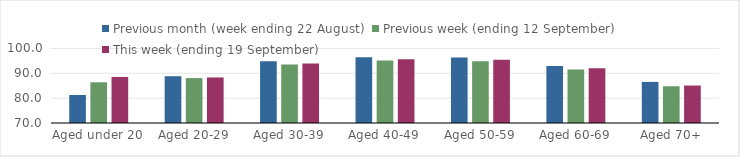
| Category | Previous month (week ending 22 August) | Previous week (ending 12 September) | This week (ending 19 September) |
|---|---|---|---|
| Aged under 20 | 81.27 | 86.38 | 88.52 |
| Aged 20-29 | 88.82 | 88.07 | 88.33 |
| Aged 30-39 | 94.84 | 93.58 | 93.97 |
| Aged 40-49 | 96.41 | 95.1 | 95.63 |
| Aged 50-59 | 96.34 | 94.89 | 95.46 |
| Aged 60-69 | 92.96 | 91.54 | 92.06 |
| Aged 70+ | 86.53 | 84.78 | 85.07 |